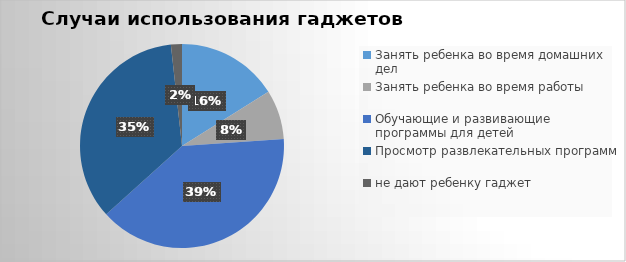
| Category | Series 0 |
|---|---|
| Занять ребенка во время домашних дел | 175 |
| Занять ребенка во время работы | 85 |
| Обучающие и развивающие программы для детей | 429 |
| Просмотр развлекательных программ | 380 |
| не дают ребенку гаджет | 19 |